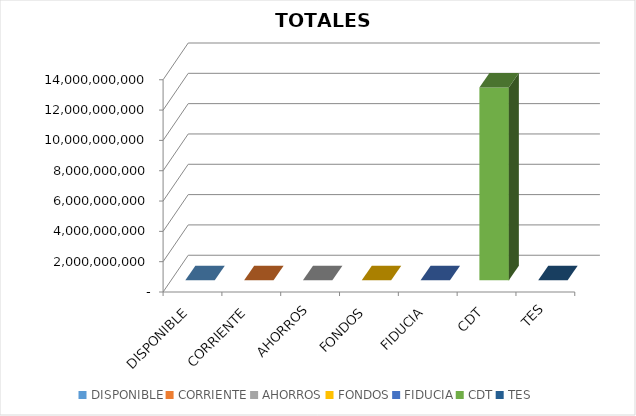
| Category | TOTALES |
|---|---|
| DISPONIBLE | 0 |
| CORRIENTE | 0 |
| AHORROS | 0 |
| FONDOS | 0 |
| FIDUCIA | 0 |
| CDT | 12714900051.562 |
| TES | 0 |